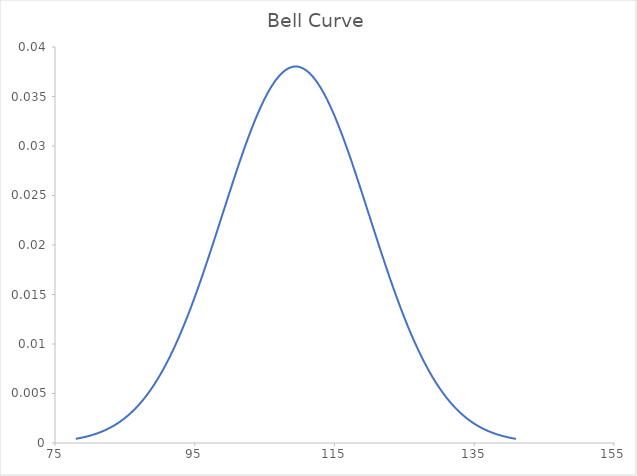
| Category | Series 0 |
|---|---|
| 77.97664785456192 | 0 |
| 78.97664785456192 | 0.001 |
| 79.97664785456192 | 0.001 |
| 80.97664785456192 | 0.001 |
| 81.97664785456192 | 0.001 |
| 82.97664785456192 | 0.002 |
| 83.97664785456192 | 0.002 |
| 84.97664785456192 | 0.003 |
| 85.97664785456192 | 0.003 |
| 86.97664785456192 | 0.004 |
| 87.97664785456192 | 0.005 |
| 88.97664785456192 | 0.006 |
| 89.97664785456192 | 0.007 |
| 90.97664785456192 | 0.008 |
| 91.97664785456192 | 0.01 |
| 92.97664785456192 | 0.011 |
| 93.97664785456192 | 0.013 |
| 94.97664785456192 | 0.015 |
| 95.97664785456192 | 0.017 |
| 96.97664785456192 | 0.019 |
| 97.97664785456192 | 0.021 |
| 98.97664785456192 | 0.023 |
| 99.97664785456192 | 0.025 |
| 100.97664785456192 | 0.027 |
| 101.97664785456192 | 0.03 |
| 102.97664785456192 | 0.031 |
| 103.97664785456192 | 0.033 |
| 104.97664785456192 | 0.035 |
| 105.97664785456192 | 0.036 |
| 106.97664785456192 | 0.037 |
| 107.97664785456192 | 0.038 |
| 108.97664785456192 | 0.038 |
| 109.97664785456192 | 0.038 |
| 110.97664785456192 | 0.038 |
| 111.97664785456192 | 0.037 |
| 112.97664785456192 | 0.036 |
| 113.97664785456192 | 0.035 |
| 114.97664785456192 | 0.033 |
| 115.97664785456192 | 0.031 |
| 116.97664785456192 | 0.029 |
| 117.97664785456192 | 0.027 |
| 118.97664785456192 | 0.025 |
| 119.97664785456192 | 0.023 |
| 120.97664785456192 | 0.021 |
| 121.97664785456192 | 0.019 |
| 122.97664785456192 | 0.017 |
| 123.97664785456192 | 0.015 |
| 124.97664785456192 | 0.013 |
| 125.97664785456192 | 0.011 |
| 126.97664785456192 | 0.009 |
| 127.97664785456192 | 0.008 |
| 128.97664785456192 | 0.007 |
| 129.97664785456192 | 0.006 |
| 130.97664785456192 | 0.005 |
| 131.97664785456192 | 0.004 |
| 132.97664785456192 | 0.003 |
| 133.97664785456192 | 0.002 |
| 134.97664785456192 | 0.002 |
| 135.97664785456192 | 0.002 |
| 136.97664785456192 | 0.001 |
| 137.97664785456192 | 0.001 |
| 138.97664785456192 | 0.001 |
| 139.97664785456192 | 0.001 |
| 140.97664785456192 | 0 |